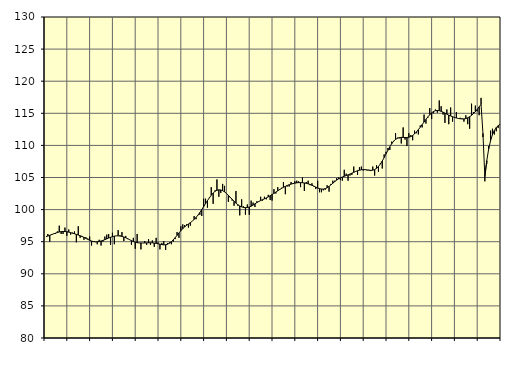
| Category | Samtliga fast anställda (inkl. fast anställda utomlands) | Series 1 |
|---|---|---|
| nan | 95.8 | 95.8 |
| 1.0 | 96.2 | 95.88 |
| 1.0 | 95 | 96 |
| 1.0 | 96.2 | 96.11 |
| 1.0 | 96.2 | 96.22 |
| 1.0 | 96.2 | 96.32 |
| 1.0 | 96.6 | 96.43 |
| 1.0 | 97.5 | 96.51 |
| 1.0 | 96.2 | 96.57 |
| 1.0 | 96.2 | 96.59 |
| 1.0 | 97.2 | 96.59 |
| 1.0 | 95.9 | 96.55 |
| nan | 96.9 | 96.49 |
| 2.0 | 96.1 | 96.41 |
| 2.0 | 96.4 | 96.32 |
| 2.0 | 96.6 | 96.24 |
| 2.0 | 94.9 | 96.14 |
| 2.0 | 97.4 | 96.04 |
| 2.0 | 95.6 | 95.93 |
| 2.0 | 95.9 | 95.81 |
| 2.0 | 95.3 | 95.67 |
| 2.0 | 95.7 | 95.52 |
| 2.0 | 95.5 | 95.37 |
| 2.0 | 95.8 | 95.22 |
| nan | 94.4 | 95.1 |
| 3.0 | 95.1 | 95.02 |
| 3.0 | 95 | 94.98 |
| 3.0 | 94.6 | 94.99 |
| 3.0 | 95.3 | 95.03 |
| 3.0 | 94.4 | 95.11 |
| 3.0 | 95 | 95.2 |
| 3.0 | 95.8 | 95.32 |
| 3.0 | 96.1 | 95.44 |
| 3.0 | 96.2 | 95.57 |
| 3.0 | 94.5 | 95.69 |
| 3.0 | 96.4 | 95.79 |
| nan | 94.6 | 95.87 |
| 4.0 | 95.9 | 95.91 |
| 4.0 | 96.8 | 95.91 |
| 4.0 | 96 | 95.88 |
| 4.0 | 96.5 | 95.82 |
| 4.0 | 95.1 | 95.73 |
| 4.0 | 95.9 | 95.62 |
| 4.0 | 95.4 | 95.48 |
| 4.0 | 95.3 | 95.32 |
| 4.0 | 94.5 | 95.17 |
| 4.0 | 95.6 | 95.03 |
| 4.0 | 93.9 | 94.93 |
| nan | 96.2 | 94.85 |
| 5.0 | 94.8 | 94.81 |
| 5.0 | 93.8 | 94.8 |
| 5.0 | 94.8 | 94.8 |
| 5.0 | 95.1 | 94.81 |
| 5.0 | 94.5 | 94.82 |
| 5.0 | 95.4 | 94.83 |
| 5.0 | 94.5 | 94.83 |
| 5.0 | 95.2 | 94.82 |
| 5.0 | 94.2 | 94.79 |
| 5.0 | 95.6 | 94.74 |
| 5.0 | 94.9 | 94.68 |
| nan | 93.8 | 94.61 |
| 6.0 | 94.8 | 94.55 |
| 6.0 | 95.1 | 94.51 |
| 6.0 | 93.7 | 94.53 |
| 6.0 | 94.8 | 94.61 |
| 6.0 | 94.9 | 94.77 |
| 6.0 | 94.6 | 95 |
| 6.0 | 95 | 95.29 |
| 6.0 | 95.4 | 95.63 |
| 6.0 | 96.5 | 95.99 |
| 6.0 | 95.6 | 96.36 |
| 6.0 | 97.4 | 96.71 |
| nan | 97.7 | 97.03 |
| 7.0 | 97.6 | 97.3 |
| 7.0 | 97.7 | 97.54 |
| 7.0 | 97.2 | 97.76 |
| 7.0 | 97.5 | 97.97 |
| 7.0 | 98.2 | 98.2 |
| 7.0 | 99 | 98.47 |
| 7.0 | 98.5 | 98.78 |
| 7.0 | 99.1 | 99.14 |
| 7.0 | 99.2 | 99.55 |
| 7.0 | 99 | 100.01 |
| 7.0 | 101.7 | 100.47 |
| nan | 101.7 | 100.94 |
| 8.0 | 100.3 | 101.4 |
| 8.0 | 101.9 | 101.83 |
| 8.0 | 103.5 | 102.23 |
| 8.0 | 100.9 | 102.58 |
| 8.0 | 103 | 102.85 |
| 8.0 | 104.7 | 103.01 |
| 8.0 | 102 | 103.08 |
| 8.0 | 102.6 | 103.06 |
| 8.0 | 104 | 102.95 |
| 8.0 | 103.7 | 102.77 |
| 8.0 | 102.5 | 102.52 |
| nan | 101.2 | 102.24 |
| 9.0 | 101.8 | 101.92 |
| 9.0 | 101.4 | 101.61 |
| 9.0 | 100.6 | 101.3 |
| 9.0 | 102.9 | 101.01 |
| 9.0 | 100.6 | 100.77 |
| 9.0 | 99.1 | 100.57 |
| 9.0 | 101.6 | 100.42 |
| 9.0 | 100.5 | 100.33 |
| 9.0 | 99.2 | 100.3 |
| 9.0 | 100.8 | 100.32 |
| 9.0 | 99.2 | 100.39 |
| nan | 101.4 | 100.52 |
| 10.0 | 101.1 | 100.7 |
| 10.0 | 100.4 | 100.89 |
| 10.0 | 101.3 | 101.09 |
| 10.0 | 101.2 | 101.26 |
| 10.0 | 102 | 101.41 |
| 10.0 | 101.4 | 101.55 |
| 10.0 | 102 | 101.68 |
| 10.0 | 101.6 | 101.82 |
| 10.0 | 102.3 | 101.98 |
| 10.0 | 101.5 | 102.15 |
| 10.0 | 101.4 | 102.34 |
| nan | 103.2 | 102.53 |
| 11.0 | 102.5 | 102.73 |
| 11.0 | 103.5 | 102.92 |
| 11.0 | 103.2 | 103.12 |
| 11.0 | 103.4 | 103.3 |
| 11.0 | 104.3 | 103.47 |
| 11.0 | 102.4 | 103.62 |
| 11.0 | 103.6 | 103.76 |
| 11.0 | 103.6 | 103.87 |
| 11.0 | 104.3 | 103.97 |
| 11.0 | 104 | 104.05 |
| 11.0 | 104.4 | 104.12 |
| nan | 104.5 | 104.17 |
| 12.0 | 104.4 | 104.2 |
| 12.0 | 103.5 | 104.2 |
| 12.0 | 105 | 104.19 |
| 12.0 | 102.9 | 104.15 |
| 12.0 | 104.3 | 104.09 |
| 12.0 | 104.5 | 104.01 |
| 12.0 | 103.8 | 103.91 |
| 12.0 | 104.1 | 103.79 |
| 12.0 | 103.6 | 103.66 |
| 12.0 | 103.2 | 103.51 |
| 12.0 | 104.5 | 103.37 |
| nan | 102.7 | 103.26 |
| 13.0 | 102.7 | 103.2 |
| 13.0 | 103 | 103.2 |
| 13.0 | 103.1 | 103.26 |
| 13.0 | 103.8 | 103.4 |
| 13.0 | 102.8 | 103.61 |
| 13.0 | 104 | 103.85 |
| 13.0 | 104.5 | 104.11 |
| 13.0 | 104.5 | 104.36 |
| 13.0 | 104.9 | 104.59 |
| 13.0 | 105 | 104.79 |
| 13.0 | 104.6 | 104.95 |
| nan | 104.5 | 105.08 |
| 14.0 | 106.2 | 105.19 |
| 14.0 | 105.6 | 105.3 |
| 14.0 | 104.5 | 105.41 |
| 14.0 | 105.3 | 105.54 |
| 14.0 | 105.4 | 105.67 |
| 14.0 | 106.7 | 105.81 |
| 14.0 | 105.9 | 105.94 |
| 14.0 | 105.4 | 106.05 |
| 14.0 | 106.6 | 106.14 |
| 14.0 | 106.7 | 106.2 |
| 14.0 | 106.1 | 106.23 |
| nan | 106.3 | 106.22 |
| 15.0 | 106.1 | 106.18 |
| 15.0 | 106.2 | 106.13 |
| 15.0 | 106 | 106.11 |
| 15.0 | 106.7 | 106.14 |
| 15.0 | 105.3 | 106.24 |
| 15.0 | 106.9 | 106.43 |
| 15.0 | 105.9 | 106.71 |
| 15.0 | 107.2 | 107.09 |
| 15.0 | 106.4 | 107.57 |
| 15.0 | 108.6 | 108.1 |
| 15.0 | 109 | 108.68 |
| nan | 109.6 | 109.25 |
| 16.0 | 109.3 | 109.79 |
| 16.0 | 110.6 | 110.27 |
| 16.0 | 110.7 | 110.65 |
| 16.0 | 111.9 | 110.93 |
| 16.0 | 111.2 | 111.11 |
| 16.0 | 111.1 | 111.21 |
| 16.0 | 110.3 | 111.25 |
| 16.0 | 112.8 | 111.24 |
| 16.0 | 110.9 | 111.23 |
| 16.0 | 109.9 | 111.23 |
| 16.0 | 111.9 | 111.27 |
| nan | 111.6 | 111.37 |
| 17.0 | 110.8 | 111.54 |
| 17.0 | 112.3 | 111.79 |
| 17.0 | 111.9 | 112.1 |
| 17.0 | 111.7 | 112.45 |
| 17.0 | 113.1 | 112.83 |
| 17.0 | 112.8 | 113.23 |
| 17.0 | 114.8 | 113.64 |
| 17.0 | 113.4 | 114.05 |
| 17.0 | 114.3 | 114.44 |
| 17.0 | 115.8 | 114.79 |
| 17.0 | 114.1 | 115.07 |
| nan | 115 | 115.28 |
| 18.0 | 115.6 | 115.41 |
| 18.0 | 115.1 | 115.44 |
| 18.0 | 117 | 115.41 |
| 18.0 | 116.1 | 115.31 |
| 18.0 | 114.8 | 115.18 |
| 18.0 | 113.5 | 115.03 |
| 18.0 | 115.6 | 114.87 |
| 18.0 | 113.3 | 114.72 |
| 18.0 | 115.9 | 114.59 |
| 18.0 | 113.7 | 114.47 |
| 18.0 | 114.4 | 114.36 |
| nan | 115.2 | 114.27 |
| 19.0 | 114.2 | 114.2 |
| 19.0 | 114.3 | 114.15 |
| 19.0 | 114.2 | 114.12 |
| 19.0 | 113.7 | 114.13 |
| 19.0 | 114.7 | 114.18 |
| 19.0 | 113.3 | 114.3 |
| 19.0 | 112.6 | 114.47 |
| 19.0 | 116.5 | 114.68 |
| 19.0 | 115.2 | 114.94 |
| 19.0 | 116.2 | 115.25 |
| 19.0 | 115.3 | 115.61 |
| nan | 114.7 | 116 |
| 20.0 | 117.4 | 116.4 |
| 20.0 | 111.3 | 111.87 |
| 20.0 | 104.4 | 105.12 |
| 20.0 | 107.1 | 107.61 |
| 20.0 | 109.9 | 109.42 |
| 20.0 | 112.3 | 110.73 |
| 20.0 | 112.6 | 111.67 |
| 20.0 | 111.7 | 112.33 |
| 20.0 | 112.2 | 112.78 |
| 20.0 | 112.7 | 113.08 |
| 20.0 | 113.3 | 113.29 |